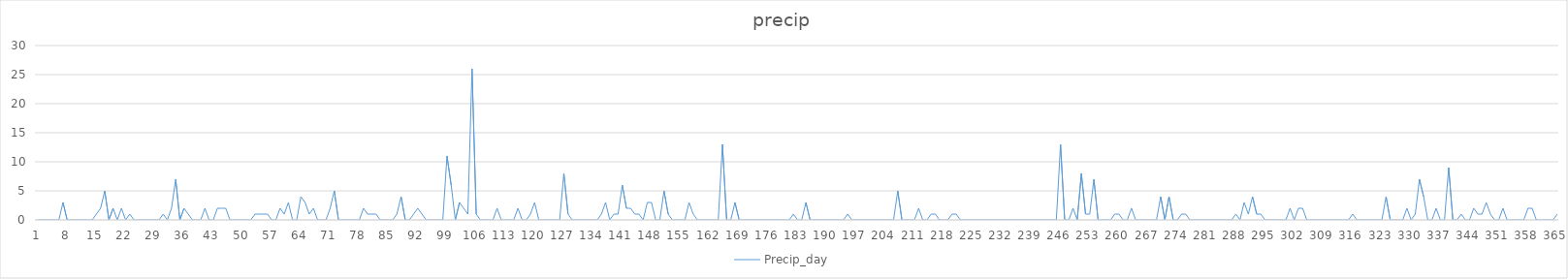
| Category | Precip_day |
|---|---|
| 0 | 0 |
| 1 | 0 |
| 2 | 0 |
| 3 | 0 |
| 4 | 0 |
| 5 | 0 |
| 6 | 3 |
| 7 | 0 |
| 8 | 0 |
| 9 | 0 |
| 10 | 0 |
| 11 | 0 |
| 12 | 0 |
| 13 | 0 |
| 14 | 1 |
| 15 | 2 |
| 16 | 5 |
| 17 | 0 |
| 18 | 2 |
| 19 | 0 |
| 20 | 2 |
| 21 | 0 |
| 22 | 1 |
| 23 | 0 |
| 24 | 0 |
| 25 | 0 |
| 26 | 0 |
| 27 | 0 |
| 28 | 0 |
| 29 | 0 |
| 30 | 1 |
| 31 | 0 |
| 32 | 2 |
| 33 | 7 |
| 34 | 0 |
| 35 | 2 |
| 36 | 1 |
| 37 | 0 |
| 38 | 0 |
| 39 | 0 |
| 40 | 2 |
| 41 | 0 |
| 42 | 0 |
| 43 | 2 |
| 44 | 2 |
| 45 | 2 |
| 46 | 0 |
| 47 | 0 |
| 48 | 0 |
| 49 | 0 |
| 50 | 0 |
| 51 | 0 |
| 52 | 1 |
| 53 | 1 |
| 54 | 1 |
| 55 | 1 |
| 56 | 0 |
| 57 | 0 |
| 58 | 2 |
| 59 | 1 |
| 60 | 3 |
| 61 | 0 |
| 62 | 0 |
| 63 | 4 |
| 64 | 3 |
| 65 | 1 |
| 66 | 2 |
| 67 | 0 |
| 68 | 0 |
| 69 | 0 |
| 70 | 2 |
| 71 | 5 |
| 72 | 0 |
| 73 | 0 |
| 74 | 0 |
| 75 | 0 |
| 76 | 0 |
| 77 | 0 |
| 78 | 2 |
| 79 | 1 |
| 80 | 1 |
| 81 | 1 |
| 82 | 0 |
| 83 | 0 |
| 84 | 0 |
| 85 | 0 |
| 86 | 1 |
| 87 | 4 |
| 88 | 0 |
| 89 | 0 |
| 90 | 1 |
| 91 | 2 |
| 92 | 1 |
| 93 | 0 |
| 94 | 0 |
| 95 | 0 |
| 96 | 0 |
| 97 | 0 |
| 98 | 11 |
| 99 | 6 |
| 100 | 0 |
| 101 | 3 |
| 102 | 2 |
| 103 | 1 |
| 104 | 26 |
| 105 | 1 |
| 106 | 0 |
| 107 | 0 |
| 108 | 0 |
| 109 | 0 |
| 110 | 2 |
| 111 | 0 |
| 112 | 0 |
| 113 | 0 |
| 114 | 0 |
| 115 | 2 |
| 116 | 0 |
| 117 | 0 |
| 118 | 1 |
| 119 | 3 |
| 120 | 0 |
| 121 | 0 |
| 122 | 0 |
| 123 | 0 |
| 124 | 0 |
| 125 | 0 |
| 126 | 8 |
| 127 | 1 |
| 128 | 0 |
| 129 | 0 |
| 130 | 0 |
| 131 | 0 |
| 132 | 0 |
| 133 | 0 |
| 134 | 0 |
| 135 | 1 |
| 136 | 3 |
| 137 | 0 |
| 138 | 1 |
| 139 | 1 |
| 140 | 6 |
| 141 | 2 |
| 142 | 2 |
| 143 | 1 |
| 144 | 1 |
| 145 | 0 |
| 146 | 3 |
| 147 | 3 |
| 148 | 0 |
| 149 | 0 |
| 150 | 5 |
| 151 | 1 |
| 152 | 0 |
| 153 | 0 |
| 154 | 0 |
| 155 | 0 |
| 156 | 3 |
| 157 | 1 |
| 158 | 0 |
| 159 | 0 |
| 160 | 0 |
| 161 | 0 |
| 162 | 0 |
| 163 | 0 |
| 164 | 13 |
| 165 | 0 |
| 166 | 0 |
| 167 | 3 |
| 168 | 0 |
| 169 | 0 |
| 170 | 0 |
| 171 | 0 |
| 172 | 0 |
| 173 | 0 |
| 174 | 0 |
| 175 | 0 |
| 176 | 0 |
| 177 | 0 |
| 178 | 0 |
| 179 | 0 |
| 180 | 0 |
| 181 | 1 |
| 182 | 0 |
| 183 | 0 |
| 184 | 3 |
| 185 | 0 |
| 186 | 0 |
| 187 | 0 |
| 188 | 0 |
| 189 | 0 |
| 190 | 0 |
| 191 | 0 |
| 192 | 0 |
| 193 | 0 |
| 194 | 1 |
| 195 | 0 |
| 196 | 0 |
| 197 | 0 |
| 198 | 0 |
| 199 | 0 |
| 200 | 0 |
| 201 | 0 |
| 202 | 0 |
| 203 | 0 |
| 204 | 0 |
| 205 | 0 |
| 206 | 5 |
| 207 | 0 |
| 208 | 0 |
| 209 | 0 |
| 210 | 0 |
| 211 | 2 |
| 212 | 0 |
| 213 | 0 |
| 214 | 1 |
| 215 | 1 |
| 216 | 0 |
| 217 | 0 |
| 218 | 0 |
| 219 | 1 |
| 220 | 1 |
| 221 | 0 |
| 222 | 0 |
| 223 | 0 |
| 224 | 0 |
| 225 | 0 |
| 226 | 0 |
| 227 | 0 |
| 228 | 0 |
| 229 | 0 |
| 230 | 0 |
| 231 | 0 |
| 232 | 0 |
| 233 | 0 |
| 234 | 0 |
| 235 | 0 |
| 236 | 0 |
| 237 | 0 |
| 238 | 0 |
| 239 | 0 |
| 240 | 0 |
| 241 | 0 |
| 242 | 0 |
| 243 | 0 |
| 244 | 0 |
| 245 | 13 |
| 246 | 0 |
| 247 | 0 |
| 248 | 2 |
| 249 | 0 |
| 250 | 8 |
| 251 | 1 |
| 252 | 1 |
| 253 | 7 |
| 254 | 0 |
| 255 | 0 |
| 256 | 0 |
| 257 | 0 |
| 258 | 1 |
| 259 | 1 |
| 260 | 0 |
| 261 | 0 |
| 262 | 2 |
| 263 | 0 |
| 264 | 0 |
| 265 | 0 |
| 266 | 0 |
| 267 | 0 |
| 268 | 0 |
| 269 | 4 |
| 270 | 0 |
| 271 | 4 |
| 272 | 0 |
| 273 | 0 |
| 274 | 1 |
| 275 | 1 |
| 276 | 0 |
| 277 | 0 |
| 278 | 0 |
| 279 | 0 |
| 280 | 0 |
| 281 | 0 |
| 282 | 0 |
| 283 | 0 |
| 284 | 0 |
| 285 | 0 |
| 286 | 0 |
| 287 | 1 |
| 288 | 0 |
| 289 | 3 |
| 290 | 1 |
| 291 | 4 |
| 292 | 1 |
| 293 | 1 |
| 294 | 0 |
| 295 | 0 |
| 296 | 0 |
| 297 | 0 |
| 298 | 0 |
| 299 | 0 |
| 300 | 2 |
| 301 | 0 |
| 302 | 2 |
| 303 | 2 |
| 304 | 0 |
| 305 | 0 |
| 306 | 0 |
| 307 | 0 |
| 308 | 0 |
| 309 | 0 |
| 310 | 0 |
| 311 | 0 |
| 312 | 0 |
| 313 | 0 |
| 314 | 0 |
| 315 | 1 |
| 316 | 0 |
| 317 | 0 |
| 318 | 0 |
| 319 | 0 |
| 320 | 0 |
| 321 | 0 |
| 322 | 0 |
| 323 | 4 |
| 324 | 0 |
| 325 | 0 |
| 326 | 0 |
| 327 | 0 |
| 328 | 2 |
| 329 | 0 |
| 330 | 1 |
| 331 | 7 |
| 332 | 4 |
| 333 | 0 |
| 334 | 0 |
| 335 | 2 |
| 336 | 0 |
| 337 | 0 |
| 338 | 9 |
| 339 | 0 |
| 340 | 0 |
| 341 | 1 |
| 342 | 0 |
| 343 | 0 |
| 344 | 2 |
| 345 | 1 |
| 346 | 1 |
| 347 | 3 |
| 348 | 1 |
| 349 | 0 |
| 350 | 0 |
| 351 | 2 |
| 352 | 0 |
| 353 | 0 |
| 354 | 0 |
| 355 | 0 |
| 356 | 0 |
| 357 | 2 |
| 358 | 2 |
| 359 | 0 |
| 360 | 0 |
| 361 | 0 |
| 362 | 0 |
| 363 | 0 |
| 364 | 1 |